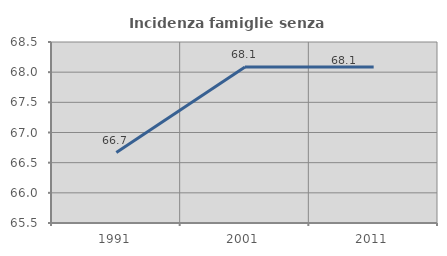
| Category | Incidenza famiglie senza nuclei |
|---|---|
| 1991.0 | 66.667 |
| 2001.0 | 68.085 |
| 2011.0 | 68.085 |